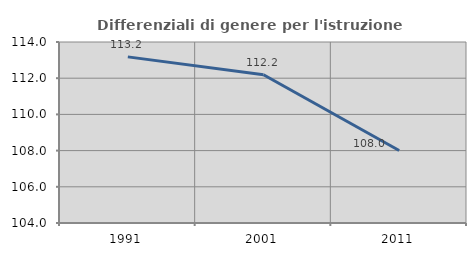
| Category | Differenziali di genere per l'istruzione superiore |
|---|---|
| 1991.0 | 113.179 |
| 2001.0 | 112.191 |
| 2011.0 | 108.002 |